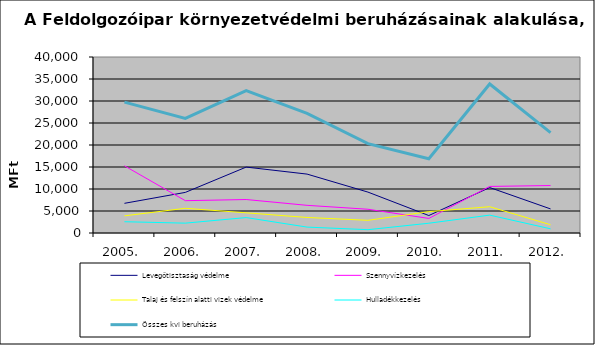
| Category | Levegőtisztaság védelme | Szennyvízkezelés | Talaj és felszín alatti vizek védelme | Hulladékkezelés | Összes kvi beruházás |
|---|---|---|---|---|---|
| 2005. | 6746.97 | 15267.918 | 3901.338 | 2560.489 | 29734.628 |
| 2006. | 9226.232 | 7346.642 | 5613.285 | 2238.586 | 26039.99 |
| 2007. | 14980.957 | 7608.5 | 4585.231 | 3506.583 | 32340.183 |
| 2008. | 13386.767 | 6285.721 | 3527.806 | 1340.141 | 27192.183 |
| 2009. | 9294.542 | 5397.069 | 2883.347 | 753.445 | 20294.471 |
| 2010. | 3969.771 | 3310.636 | 4851.85 | 2222.182 | 16872.477 |
| 2011. | 10337.271 | 10584.801 | 5973.784 | 4063.269 | 33870.645 |
| 2012. | 5470.52 | 10788.406 | 1875.033 | 951.494 | 22810.827 |